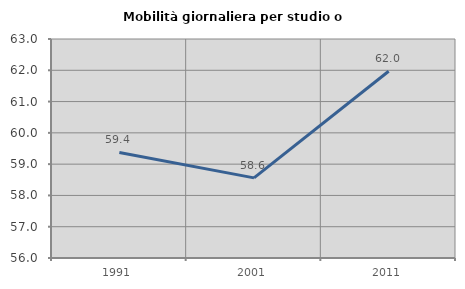
| Category | Mobilità giornaliera per studio o lavoro |
|---|---|
| 1991.0 | 59.375 |
| 2001.0 | 58.562 |
| 2011.0 | 61.969 |